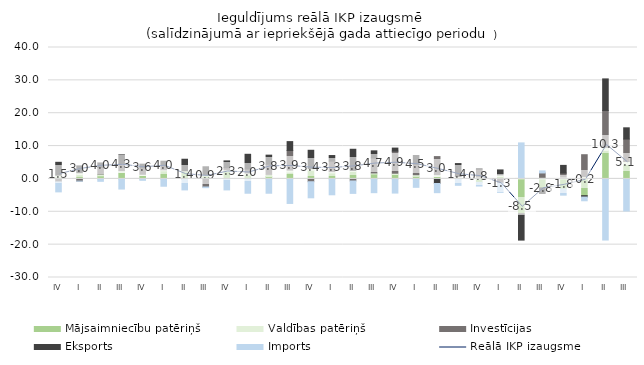
| Category | Mājsaimniecību patēriņš | Valdības patēriņš | Investīcijas | Eksports | Imports |
|---|---|---|---|---|---|
| IV | 0.515 | 0.633 | -0.91 | 3.908 | -3.031 |
| I | 1.307 | 0.595 | -0.669 | 2.073 | -0.01 |
| II | 0.953 | 0.546 | 1.992 | 1.375 | -0.729 |
| III | 2.017 | 0.495 | 2.099 | 2.712 | -3.08 |
| IV | 1.043 | 0.366 | 1.951 | 1.141 | -0.426 |
| I | 2.462 | 0.323 | 1.178 | 1.435 | -2.222 |
| II | 2.154 | 0.314 | -0.053 | 3.526 | -3.287 |
| III | 0.886 | 0.38 | -2.458 | 2.437 | -0.201 |
| IV | 2.234 | 0.537 | 0.637 | 2.082 | -3.345 |
| I | 1.208 | 0.599 | 1.204 | 4.488 | -4.355 |
| II | 0.7 | 0.678 | 3.07 | 2.789 | -4.355 |
| III | 2.05 | 0.652 | 5.963 | 2.693 | -7.464 |
| IV | 2.609 | 0.536 | -0.855 | 5.574 | -4.887 |
| I | 1.817 | 0.427 | 3.167 | 1.709 | -4.827 |
| II | 2.277 | 0.33 | -0.627 | 6.423 | -3.773 |
| III | 1.506 | 0.316 | 4.54 | 2.186 | -4.184 |
| IV | 1.352 | 0.386 | 6.728 | 0.919 | -4.305 |
| I | 0.782 | 0.499 | 3.207 | 2.635 | -2.555 |
| II | 0.72 | 0.592 | 5.485 | -1.383 | -2.799 |
| III | 0.095 | 0.624 | 0.131 | 3.824 | -1.944 |
| IV | -1.052 | 0.582 | 2.368 | 0.187 | -1.112 |
| I | 0.734 | 0.508 | -1.301 | 1.496 | -2.781 |
| II | -10.528 | 0.434 | -0.353 | -7.734 | 10.532 |
| III | -2.723 | 0.48 | 1.333 | -1.703 | 0.63 |
| IV | -3.039 | 0.58 | 1.191 | 2.349 | -1.899 |
| I | -5.09 | 0.713 | 6.658 | -0.431 | -1.125 |
| II | 8.67 | 0.951 | 11.219 | 9.604 | -18.6 |
| III | 4.379 | 0.929 | 6.828 | 3.419 | -9.762 |